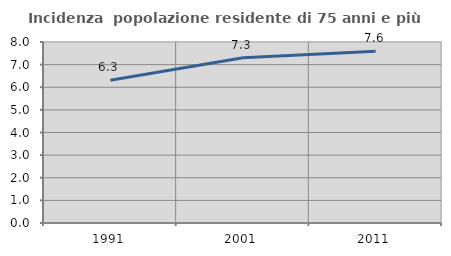
| Category | Incidenza  popolazione residente di 75 anni e più |
|---|---|
| 1991.0 | 6.312 |
| 2001.0 | 7.306 |
| 2011.0 | 7.587 |